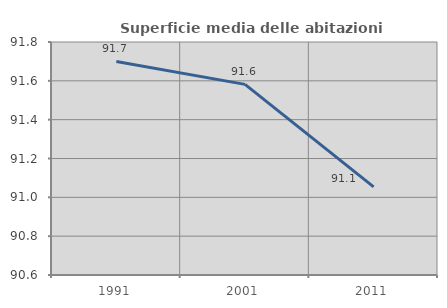
| Category | Superficie media delle abitazioni occupate |
|---|---|
| 1991.0 | 91.7 |
| 2001.0 | 91.582 |
| 2011.0 | 91.053 |